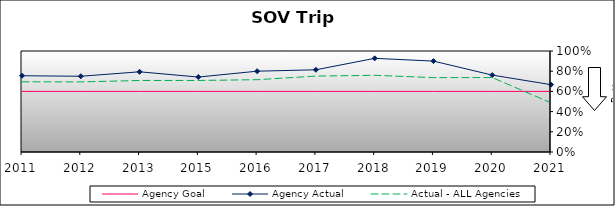
| Category | Agency Goal | Agency Actual | Actual - ALL Agencies |
|---|---|---|---|
| 2011.0 | 0.6 | 0.755 | 0.695 |
| 2012.0 | 0.6 | 0.75 | 0.694 |
| 2013.0 | 0.6 | 0.794 | 0.708 |
| 2015.0 | 0.6 | 0.742 | 0.708 |
| 2016.0 | 0.6 | 0.8 | 0.716 |
| 2017.0 | 0.6 | 0.814 | 0.752 |
| 2018.0 | 0.6 | 0.927 | 0.759 |
| 2019.0 | 0.6 | 0.9 | 0.736 |
| 2020.0 | 0.6 | 0.762 | 0.737 |
| 2021.0 | 0.6 | 0.667 | 0.487 |